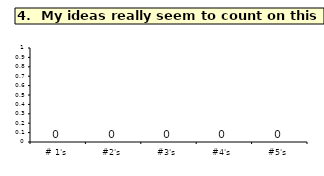
| Category | Q_4 |
|---|---|
| # 1's | 0 |
| #2's | 0 |
| #3's | 0 |
| #4's | 0 |
| #5's | 0 |